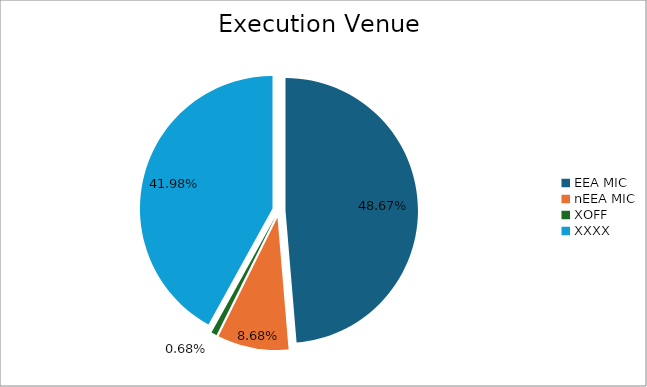
| Category | Series 0 |
|---|---|
| EEA MIC | 5821174.335 |
| nEEA MIC | 1037938.302 |
| XOFF | 81264.346 |
| XXXX | 5020805.127 |